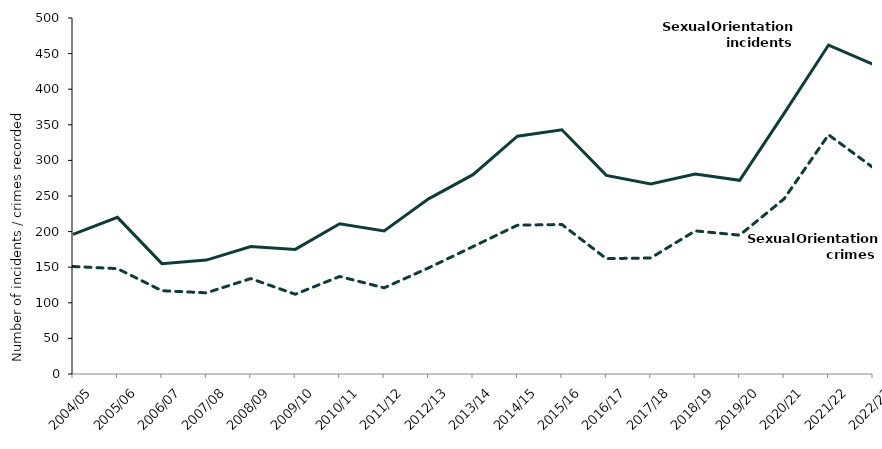
| Category | Sexual Orientation incidents | Sexual Orientation crimes |
|---|---|---|
| 2004/05 | 196 | 151 |
| 2005/06 | 220 | 148 |
| 2006/07 | 155 | 117 |
| 2007/08 | 160 | 114 |
| 2008/09 | 179 | 134 |
| 2009/10 | 175 | 112 |
| 2010/11 | 211 | 137 |
| 2011/12 | 201 | 121 |
| 2012/13 | 246 | 149 |
| 2013/14 | 280 | 179 |
| 2014/15 | 334 | 209 |
| 2015/16 | 343 | 210 |
| 2016/17 | 279 | 162 |
| 2017/18 | 267 | 163 |
| 2018/19 | 281 | 201 |
| 2019/20 | 272 | 195 |
| 2020/21 | 366 | 246 |
| 2021/22 | 462 | 336 |
| 2022/23 | 435 | 290 |